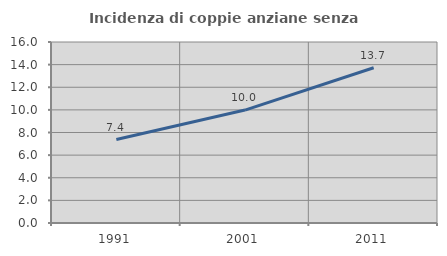
| Category | Incidenza di coppie anziane senza figli  |
|---|---|
| 1991.0 | 7.377 |
| 2001.0 | 9.984 |
| 2011.0 | 13.722 |